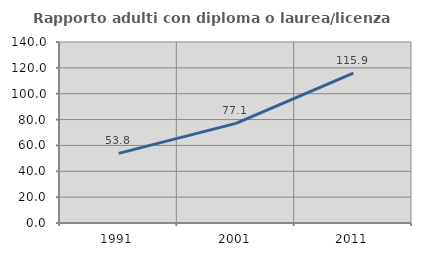
| Category | Rapporto adulti con diploma o laurea/licenza media  |
|---|---|
| 1991.0 | 53.846 |
| 2001.0 | 77.083 |
| 2011.0 | 115.868 |